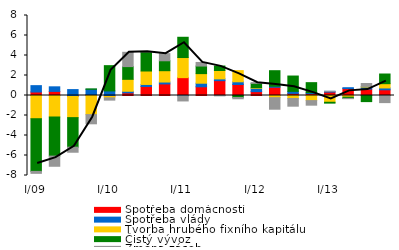
| Category | Spotřeba domácností | Spotřeba vlády | Tvorba hrubého fixního kapitálu | Čistý vývoz | Změna zásob |
|---|---|---|---|---|---|
| I/09 | 0.35 | 0.636 | -2.322 | -5.266 | -0.196 |
| II | 0.41 | 0.457 | -2.15 | -3.911 | -1.016 |
| III | -0.098 | 0.591 | -2.115 | -2.955 | -0.507 |
| IV | 0.094 | 0.525 | -1.912 | 0.04 | -0.919 |
| I/10 | -0.104 | 0.458 | -0.129 | 2.527 | -0.229 |
| II | 0.265 | 0.159 | 1.194 | 1.271 | 1.431 |
| III | 0.903 | 0.201 | 1.345 | 1.909 | 0.026 |
| IV | 1.16 | 0.187 | 1.133 | 0.993 | 0.714 |
| I/11 | 1.785 | -0.031 | 2.011 | 2.027 | -0.514 |
| II | 0.872 | 0.356 | 0.96 | 0.756 | 0.361 |
| III | 1.484 | 0.177 | 0.84 | 0.448 | -0.034 |
| IV | 1.102 | 0.267 | 1.119 | -0.198 | -0.129 |
| I/12 | 0.386 | 0.336 | 0.068 | 0.426 | 0.068 |
| II | 0.824 | 0.103 | -0.218 | 1.553 | -1.153 |
| III | 0.209 | 0.205 | -0.302 | 1.533 | -0.766 |
| IV | 0.187 | 0.099 | -0.51 | 0.998 | -0.458 |
| I/13 | 0.342 | 0.071 | -0.676 | -0.087 | 0.013 |
| II | 0.691 | 0.088 | -0.167 | -0.121 | -0.029 |
| III | 0.642 | 0.199 | 0.066 | -0.611 | 0.292 |
| IV | 0.571 | 0.183 | 0.428 | 0.967 | -0.711 |